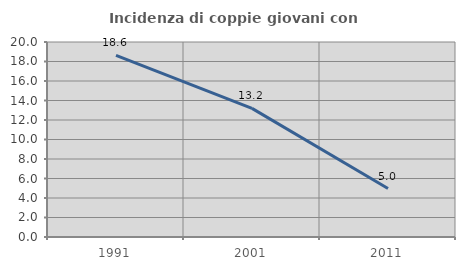
| Category | Incidenza di coppie giovani con figli |
|---|---|
| 1991.0 | 18.626 |
| 2001.0 | 13.191 |
| 2011.0 | 4.971 |